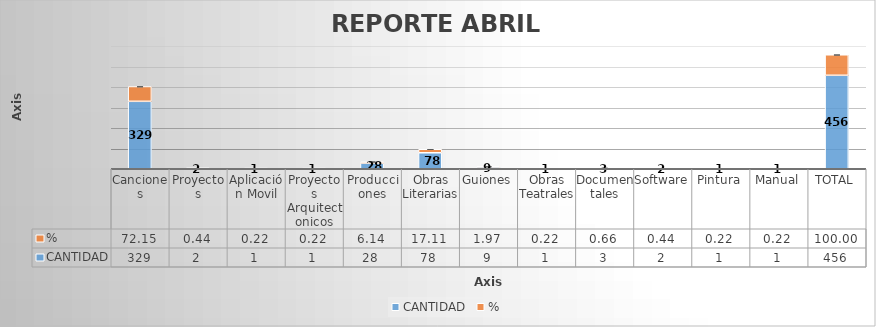
| Category | CANTIDAD | % |
|---|---|---|
| Canciones | 329 | 72.149 |
| Proyectos | 2 | 0.439 |
| Aplicación Movil | 1 | 0.219 |
| Proyectos Arquitectonicos | 1 | 0.219 |
| Producciones | 28 | 6.14 |
| Obras Literarias | 78 | 17.105 |
| Guiones | 9 | 1.974 |
| Obras Teatrales | 1 | 0.219 |
| Documentales | 3 | 0.658 |
| Software | 2 | 0.439 |
| Pintura | 1 | 0.219 |
| Manual | 1 | 0.219 |
| TOTAL | 456 | 100 |